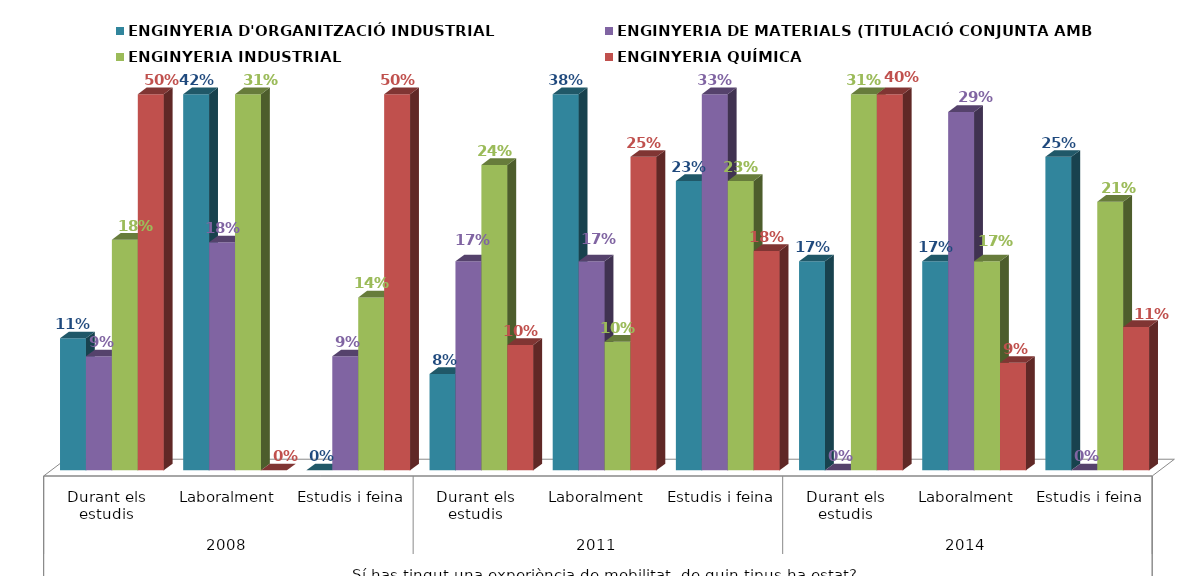
| Category | ENGINYERIA D'ORGANITZACIÓ INDUSTRIAL | ENGINYERIA DE MATERIALS (TITULACIÓ CONJUNTA AMB LA UB) | ENGINYERIA INDUSTRIAL | ENGINYERIA QUÍMICA |
|---|---|---|---|---|
| 0 | 0.105 | 0.091 | 0.184 | 0.5 |
| 1 | 0.421 | 0.182 | 0.31 | 0 |
| 2 | 0 | 0.091 | 0.138 | 0.5 |
| 3 | 0.077 | 0.167 | 0.244 | 0.1 |
| 4 | 0.385 | 0.167 | 0.103 | 0.25 |
| 5 | 0.231 | 0.333 | 0.231 | 0.175 |
| 6 | 0.167 | 0 | 0.31 | 0.4 |
| 7 | 0.167 | 0.286 | 0.167 | 0.086 |
| 8 | 0.25 | 0 | 0.214 | 0.114 |